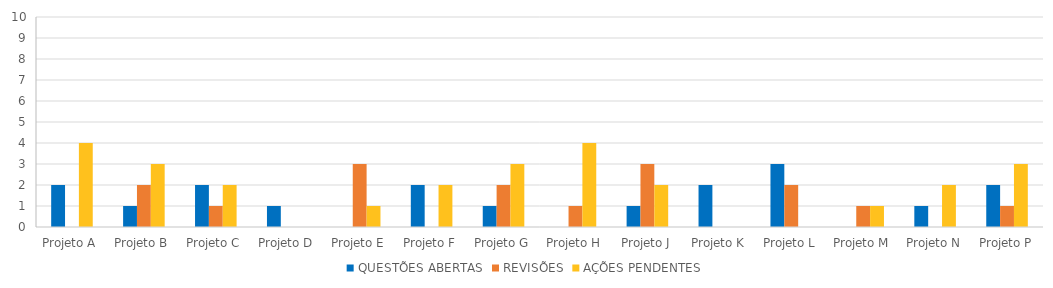
| Category | QUESTÕES ABERTAS | REVISÕES | AÇÕES PENDENTES |
|---|---|---|---|
| Projeto A | 2 | 0 | 4 |
| Projeto B | 1 | 2 | 3 |
| Projeto C | 2 | 1 | 2 |
| Projeto D | 1 | 0 | 0 |
| Projeto E | 0 | 3 | 1 |
| Projeto F | 2 | 0 | 2 |
| Projeto G | 1 | 2 | 3 |
| Projeto H | 0 | 1 | 4 |
| Projeto J | 1 | 3 | 2 |
| Projeto K | 2 | 0 | 0 |
| Projeto L | 3 | 2 | 0 |
| Projeto M | 0 | 1 | 1 |
| Projeto N | 1 | 0 | 2 |
| Projeto P | 2 | 1 | 3 |